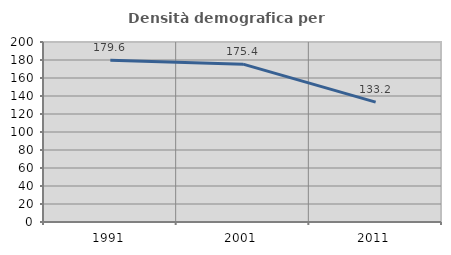
| Category | Densità demografica |
|---|---|
| 1991.0 | 179.632 |
| 2001.0 | 175.38 |
| 2011.0 | 133.229 |